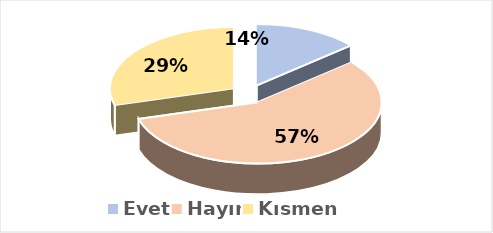
| Category | Evet |
|---|---|
| Evet | 0.137 |
| Hayır | 0.569 |
| Kısmen | 0.294 |